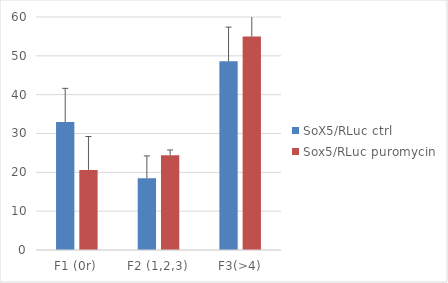
| Category | SoX5/RLuc ctrl | Sox5/RLuc puromycin |
|---|---|---|
| F1 (0r) | 32.938 | 20.623 |
| F2 (1,2,3) | 18.463 | 24.407 |
| F3(>4) | 48.599 | 54.97 |